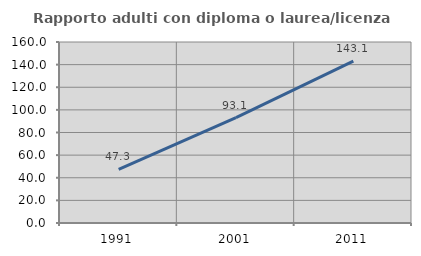
| Category | Rapporto adulti con diploma o laurea/licenza media  |
|---|---|
| 1991.0 | 47.321 |
| 2001.0 | 93.082 |
| 2011.0 | 143.056 |